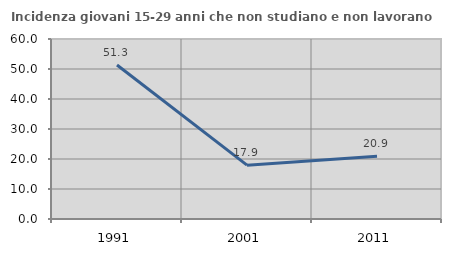
| Category | Incidenza giovani 15-29 anni che non studiano e non lavorano  |
|---|---|
| 1991.0 | 51.316 |
| 2001.0 | 17.949 |
| 2011.0 | 20.896 |